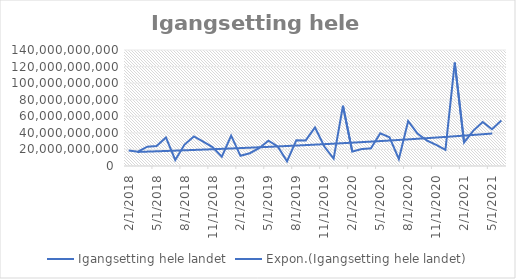
| Category | Igangsetting hele landet |
|---|---|
| 2/1/18 | 18660000000 |
| 3/1/18 | 17261375000 |
| 4/1/18 | 23334190000 |
| 5/1/18 | 24102380000 |
| 6/1/18 | 34509350000 |
| 7/1/18 | 7265935000 |
| 8/1/18 | 25877670000 |
| 9/1/18 | 35673650000 |
| 10/1/18 | 29322609000 |
| 11/1/18 | 22781140000 |
| 12/1/18 | 11295130000 |
| 1/1/19 | 36682530000 |
| 2/1/19 | 12273400000 |
| 3/1/19 | 15416300000 |
| 4/1/19 | 21442090000 |
| 5/1/19 | 30537055000 |
| 6/1/19 | 23695881000 |
| 7/1/19 | 5719770000 |
| 8/1/19 | 31119400000 |
| 9/1/19 | 30857750000 |
| 10/1/19 | 46433880000 |
| 11/1/19 | 23547000000 |
| 12/1/19 | 8839450000 |
| 1/1/20 | 72658325000 |
| 2/1/20 | 17417750000 |
| 3/1/20 | 20437540000 |
| 4/1/20 | 21262430000 |
| 5/1/20 | 39448250000 |
| 6/1/20 | 34654205000 |
| 7/1/20 | 8358515000 |
| 8/1/20 | 54214914000 |
| 9/1/20 | 39127665000 |
| 10/1/20 | 30780475000 |
| 11/1/20 | 25543080000 |
| 12/1/20 | 19510750000 |
| 1/1/21 | 124866935000 |
| 2/1/21 | 28458360000 |
| 3/1/21 | 42699110000 |
| 4/1/21 | 53165350000 |
| 5/1/21 | 44292100000 |
| 6/1/21 | 54998955000 |